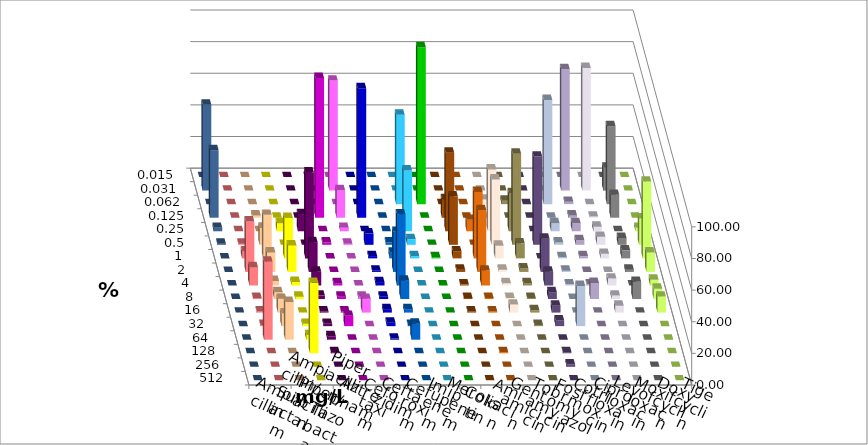
| Category | Ampicillin | Ampicillin/ Sulbactam | Piperacillin | Piperacillin/ Tazobactam | Aztreonam | Cefotaxim | Ceftazidim | Cefuroxim | Imipenem | Meropenem | Colistin | Amikacin | Gentamicin | Tobramycin | Fosfomycin | Cotrimoxazol | Ciprofloxacin | Levofloxacin | Moxifloxacin | Doxycyclin | Tigecyclin |
|---|---|---|---|---|---|---|---|---|---|---|---|---|---|---|---|---|---|---|---|---|---|
| 0.015 | 0 | 0 | 0 | 0 | 0 | 0 | 0 | 0 | 0 | 0 | 0 | 0 | 0 | 0 | 0 | 0 | 0 | 0 | 0 | 0 | 0 |
| 0.031 | 0 | 0 | 0 | 0 | 0 | 69.565 | 0 | 0 | 0 | 0 | 0 | 0 | 0 | 0 | 0 | 0 | 76.812 | 77.536 | 14.493 | 0 | 54.348 |
| 0.062 | 0 | 0 | 0 | 0 | 0 | 0 | 0 | 0 | 56.522 | 99.275 | 0 | 0 | 2.899 | 2.19 | 0 | 65.942 | 1.449 | 0 | 49.275 | 0 | 0 |
| 0.125 | 0 | 1.449 | 0 | 0 | 88.406 | 17.391 | 81.884 | 0 | 0 | 0 | 11.679 | 0 | 0 | 0 | 0 | 0 | 1.449 | 0.725 | 14.493 | 0 | 42.754 |
| 0.25 | 0 | 0 | 5.109 | 10.87 | 0 | 2.174 | 0 | 0 | 38.406 | 0 | 49.635 | 7.246 | 39.13 | 24.088 | 0 | 5.072 | 5.072 | 2.899 | 0 | 2.174 | 2.174 |
| 0.5 | 0.725 | 10.87 | 0 | 0 | 1.449 | 0.725 | 7.246 | 1.449 | 3.623 | 0 | 30.657 | 0 | 41.304 | 57.664 | 55.797 | 1.449 | 2.899 | 5.072 | 4.348 | 16.667 | 0.725 |
| 1.0 | 4.348 | 27.536 | 25.547 | 54.348 | 0 | 0 | 1.449 | 3.623 | 1.449 | 0.725 | 4.38 | 42.029 | 7.971 | 9.489 | 0 | 0.725 | 1.449 | 2.899 | 5.072 | 48.551 | 0 |
| 2.0 | 31.884 | 12.319 | 16.788 | 18.841 | 0 | 0 | 0.725 | 25.362 | 0 | 0 | 1.46 | 39.13 | 1.449 | 2.19 | 21.014 | 0.725 | 0 | 0 | 1.449 | 12.319 | 0 |
| 4.0 | 11.594 | 2.899 | 2.19 | 8.696 | 1.449 | 0 | 2.174 | 44.928 | 0 | 0 | 0.73 | 9.42 | 1.449 | 1.46 | 8.696 | 0.725 | 0.725 | 4.348 | 0 | 3.623 | 0 |
| 8.0 | 0.725 | 4.348 | 1.46 | 2.174 | 1.449 | 1.449 | 1.449 | 11.594 | 0 | 0 | 0.73 | 0.725 | 0.725 | 0.73 | 4.348 | 0 | 10.145 | 2.174 | 10.87 | 6.522 | 0 |
| 16.0 | 0.725 | 8.696 | 0 | 0.725 | 0.725 | 8.696 | 2.174 | 2.174 | 0 | 0 | 0.73 | 0.725 | 5.072 | 1.46 | 4.348 | 0 | 0 | 4.348 | 0 | 10.145 | 0 |
| 32.0 | 0.725 | 7.971 | 1.46 | 1.449 | 6.522 | 0 | 2.174 | 0.725 | 0 | 0 | 0 | 0 | 0 | 0.73 | 3.623 | 25.362 | 0 | 0 | 0 | 0 | 0 |
| 64.0 | 49.275 | 23.913 | 2.92 | 2.174 | 0 | 0 | 0.725 | 10.145 | 0 | 0 | 0 | 0 | 0 | 0 | 0 | 0 | 0 | 0 | 0 | 0 | 0 |
| 128.0 | 0 | 0 | 44.526 | 0.725 | 0 | 0 | 0 | 0 | 0 | 0 | 0 | 0.725 | 0 | 0 | 0.725 | 0 | 0 | 0 | 0 | 0 | 0 |
| 256.0 | 0 | 0 | 0 | 0 | 0 | 0 | 0 | 0 | 0 | 0 | 0 | 0 | 0 | 0 | 1.449 | 0 | 0 | 0 | 0 | 0 | 0 |
| 512.0 | 0 | 0 | 0 | 0 | 0 | 0 | 0 | 0 | 0 | 0 | 0 | 0 | 0 | 0 | 0 | 0 | 0 | 0 | 0 | 0 | 0 |